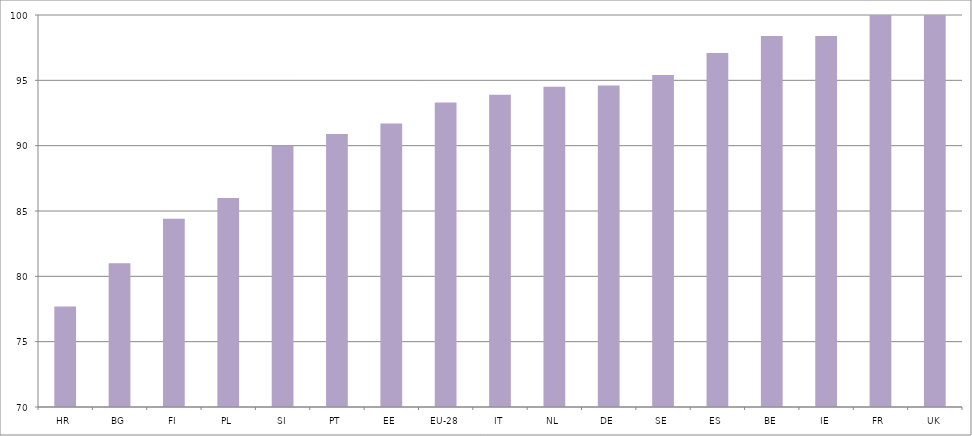
| Category | 2017 |
|---|---|
| HR | 77.7 |
| BG | 81 |
| FI | 84.4 |
| PL | 86 |
| SI | 90 |
| PT | 90.9 |
| EE | 91.7 |
| EU-28 | 93.3 |
| IT | 93.9 |
| NL | 94.5 |
| DE | 94.6 |
| SE | 95.4 |
| ES | 97.1 |
| BE | 98.4 |
| IE | 98.4 |
| FR | 100 |
| UK | 100 |